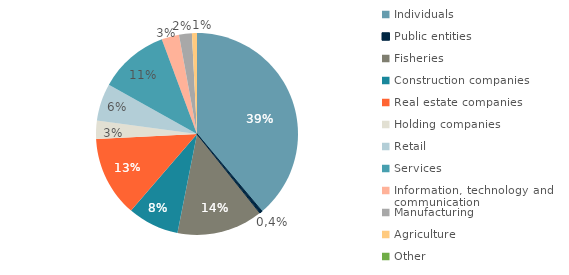
| Category | Series 0 |
|---|---|
| Individuals | 413699 |
| Public entities | 4720 |
| Fisheries | 146912 |
| Construction companies  | 87510 |
| Real estate companies | 137343 |
| Holding companies | 30971 |
| Retail | 63644 |
| Services | 119439 |
| Information, technology and communication | 29799 |
| Manufacturing | 21936 |
| Agriculture | 8559 |
| Other | 0 |